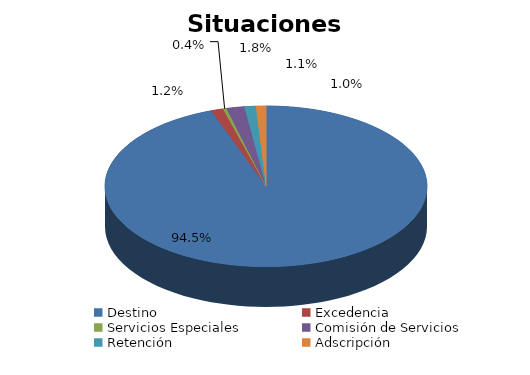
| Category | Series 0 |
|---|---|
| Destino | 2410 |
| Excedencia | 31 |
| Servicios Especiales | 9 |
| Comisión de Servicios | 46 |
| Retención | 29 |
| Adscripción | 26 |